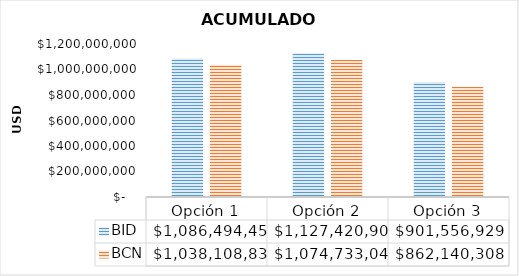
| Category | BID | BCN |
|---|---|---|
| Opción 1 | 1086494455.597 | 1038108832.411 |
| Opción 2 | 1127420908.335 | 1074733042.613 |
| Opción 3 | 901556929.196 | 862140307.774 |